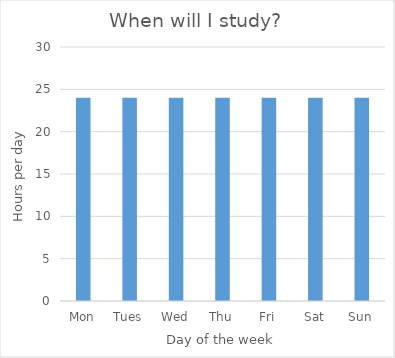
| Category | Series 0 |
|---|---|
| Mon | 24 |
| Tues | 24 |
| Wed | 24 |
| Thu | 24 |
| Fri | 24 |
| Sat | 24 |
| Sun | 24 |